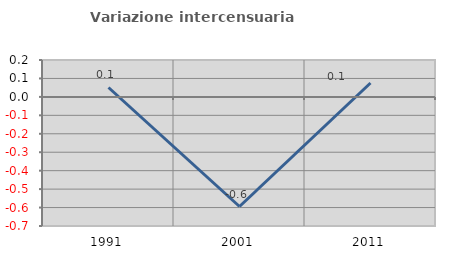
| Category | Variazione intercensuaria annua |
|---|---|
| 1991.0 | 0.051 |
| 2001.0 | -0.594 |
| 2011.0 | 0.075 |